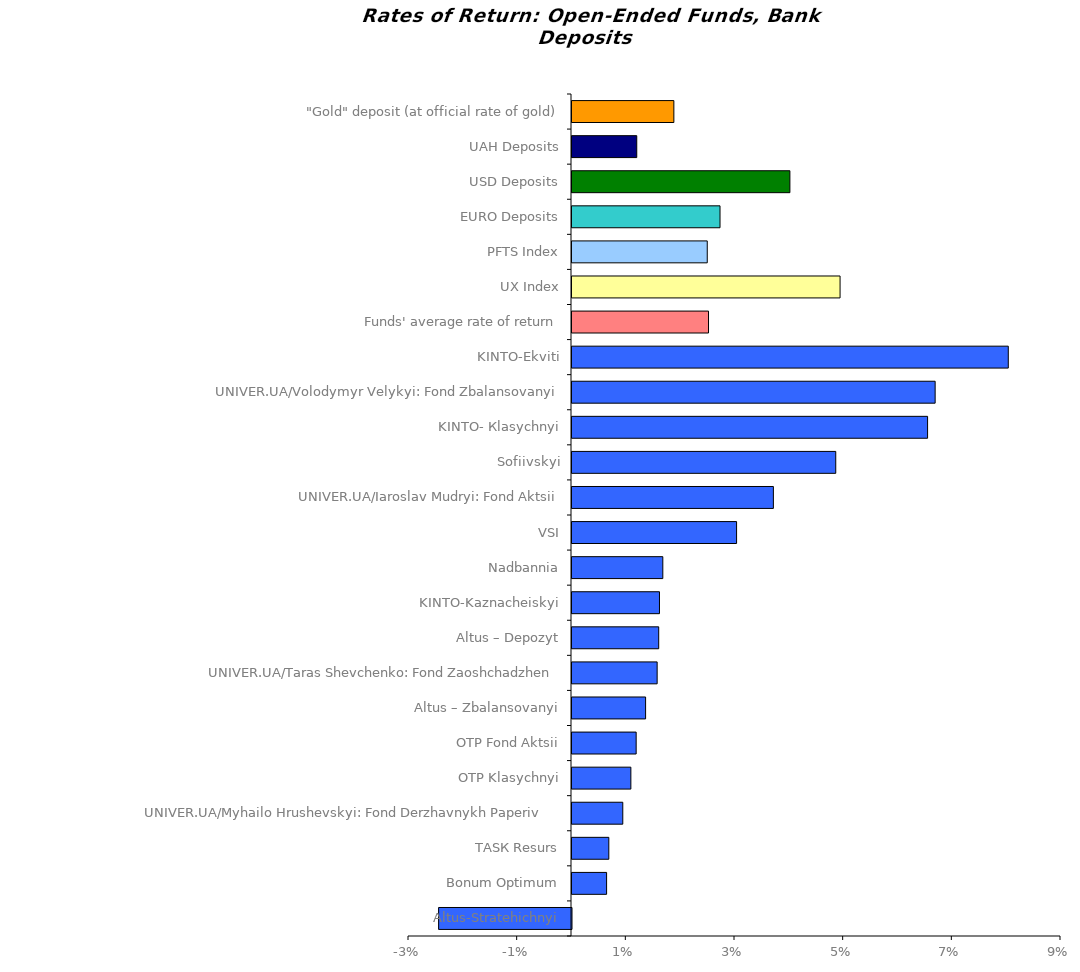
| Category | Series 0 |
|---|---|
| Altus-Stratehichnyi | -0.024 |
| Bonum Optimum | 0.006 |
| ТАSК Resurs | 0.007 |
| UNIVER.UA/Myhailo Hrushevskyi: Fond Derzhavnykh Paperiv    | 0.009 |
| ОТP Klasychnyi | 0.011 |
| ОТP Fond Aktsii | 0.012 |
| Altus – Zbalansovanyi | 0.014 |
| UNIVER.UA/Taras Shevchenko: Fond Zaoshchadzhen | 0.016 |
| Altus – Depozyt | 0.016 |
| KINTO-Kaznacheiskyi | 0.016 |
| Nadbannia | 0.017 |
| VSI | 0.03 |
| UNIVER.UA/Iaroslav Mudryi: Fond Aktsii | 0.037 |
| Sofiivskyi | 0.049 |
| KINTO- Кlasychnyi | 0.065 |
| UNIVER.UA/Volodymyr Velykyi: Fond Zbalansovanyi | 0.067 |
| KINTO-Ekviti | 0.08 |
| Funds' average rate of return | 0.025 |
| UX Index | 0.049 |
| PFTS Index | 0.025 |
| EURO Deposits | 0.027 |
| USD Deposits | 0.04 |
| UAH Deposits | 0.012 |
| "Gold" deposit (at official rate of gold) | 0.019 |